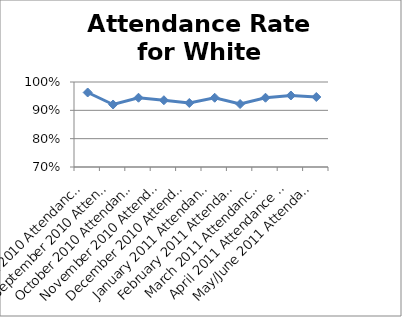
| Category | Attendance for White Students |
|---|---|
| August 2010 Attendance Rate | 0.963 |
| September 2010 Attendance Rate | 0.921 |
| October 2010 Attendance Rate | 0.944 |
| November 2010 Attendance Rate | 0.936 |
| December 2010 Attendance Rate | 0.926 |
| January 2011 Attendance Rate | 0.944 |
| February 2011 Attendance Rate | 0.922 |
| March 2011 Attendance Rate | 0.944 |
| April 2011 Attendance Rate | 0.952 |
| May/June 2011 Attendance Rate | 0.947 |